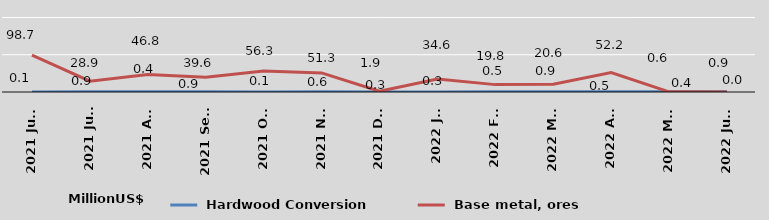
| Category |  Hardwood Conversion |  Base metal, ores     |
|---|---|---|
| 2021 June | 0.1 | 98.7 |
| 2021 July | 0.9 | 28.9 |
| 2021 Aug | 0.4 | 46.8 |
| 2021 Sept | 0.9 | 39.6 |
| 2021 Oct | 0.1 | 56.3 |
| 2021 Nov | 0.6 | 51.3 |
| 2021 Dec | 0.3 | 1.9 |
| 2022 Jan | 0.3 | 34.6 |
| 2022 Feb | 0.5 | 19.8 |
| 2022 Mar | 0.9 | 20.6 |
| 2022 Apr | 0.5 | 52.2 |
| 2022 May | 0.6 | 0.4 |
| 2022 June | 0.9 | 0 |